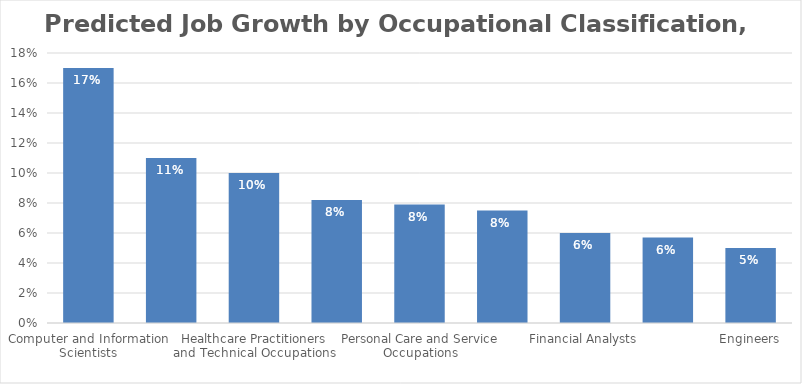
| Category | Predicted Change |
|---|---|
| Computer and Information Scientists | 0.17 |
| Community and Social Service Occupations | 0.11 |
| Healthcare Practitioners and Technical Occupations | 0.1 |
| Healthcare Support Occupations | 0.082 |
| Personal Care and Service Occupations | 0.079 |
| Construction and Related Occupations | 0.075 |
| Financial Analysts | 0.06 |
| Education, Training, and Library Occupations | 0.057 |
| Engineers | 0.05 |